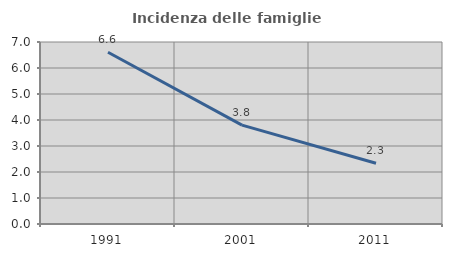
| Category | Incidenza delle famiglie numerose |
|---|---|
| 1991.0 | 6.607 |
| 2001.0 | 3.805 |
| 2011.0 | 2.338 |